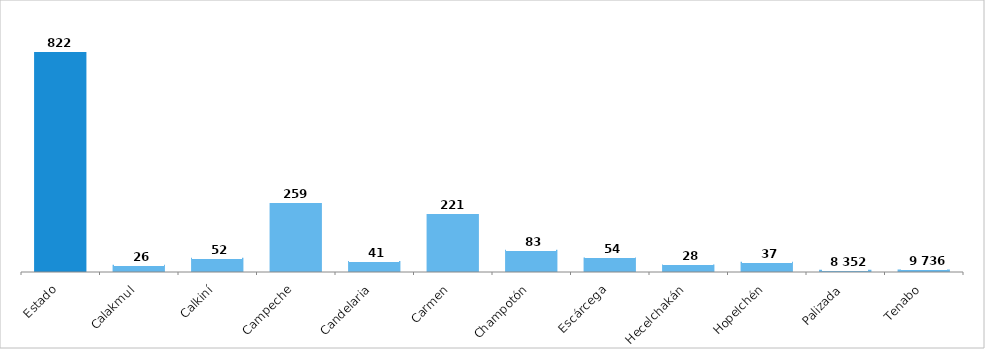
| Category | Población total |
|---|---|
| Estado | 822441 |
| Calakmul | 26882 |
| Calkiní | 52890 |
| Campeche | 259005 |
| Candelaria | 41194 |
| Carmen | 221094 |
| Champotón | 83021 |
| Escárcega | 54184 |
| Hecelchakán | 28306 |
| Hopelchén | 37777 |
| Palizada | 8352 |
| Tenabo | 9736 |